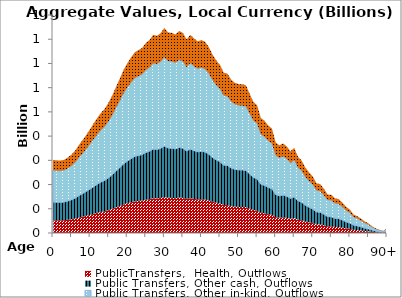
| Category | PublicTransfers,  Health, Outflows | Public Transfers, Other cash, Outflows | Public Transfers, Other in-kind, Outflows | Public Transfers, Education, Outflows |
|---|---|---|---|---|
| 0 | 52.944 | 74.813 | 130.972 | 43.032 |
|  | 52.658 | 74.41 | 130.266 | 42.8 |
| 2 | 52.478 | 74.155 | 129.82 | 42.654 |
| 3 | 52.986 | 74.873 | 131.077 | 43.067 |
| 4 | 54.716 | 77.317 | 135.356 | 44.472 |
| 5 | 56.821 | 80.292 | 140.565 | 46.184 |
| 6 | 59.765 | 84.452 | 147.847 | 48.577 |
| 7 | 63.808 | 90.165 | 157.848 | 51.862 |
| 8 | 67.337 | 95.151 | 166.577 | 54.731 |
| 9 | 71.223 | 100.643 | 176.191 | 57.889 |
| 10 | 75.268 | 106.359 | 186.198 | 61.177 |
| 11 | 79.528 | 112.378 | 196.736 | 64.639 |
| 12 | 83.635 | 118.181 | 206.895 | 67.978 |
| 13 | 87.247 | 123.286 | 215.831 | 70.914 |
| 14 | 90.189 | 127.442 | 223.108 | 73.305 |
| 15 | 94.612 | 133.694 | 234.052 | 76.9 |
| 16 | 99.806 | 141.033 | 246.9 | 81.122 |
| 17 | 105.879 | 149.614 | 261.924 | 86.058 |
| 18 | 111.86 | 158.065 | 276.719 | 90.919 |
| 19 | 118.037 | 166.794 | 292 | 95.94 |
| 20 | 122.884 | 173.643 | 303.991 | 99.879 |
| 21 | 127.024 | 179.494 | 314.232 | 103.244 |
| 22 | 130.789 | 184.813 | 323.545 | 106.304 |
| 23 | 132.475 | 187.195 | 327.715 | 107.674 |
| 24 | 133.966 | 189.303 | 331.405 | 108.886 |
| 25 | 137.616 | 194.461 | 340.435 | 111.853 |
| 26 | 139.808 | 197.558 | 345.858 | 113.635 |
| 27 | 143.558 | 202.857 | 355.133 | 116.683 |
| 28 | 142.825 | 201.82 | 353.319 | 116.087 |
| 29 | 144.731 | 204.514 | 358.035 | 117.636 |
| 30 | 148.519 | 209.868 | 367.407 | 120.715 |
| 31 | 145.311 | 205.334 | 359.47 | 118.107 |
| 32 | 144.977 | 204.863 | 358.645 | 117.836 |
| 33 | 143.765 | 203.15 | 355.646 | 116.851 |
| 34 | 146.423 | 206.905 | 362.22 | 119.011 |
| 35 | 144.92 | 204.782 | 358.504 | 117.79 |
| 36 | 140.269 | 198.21 | 346.998 | 114.01 |
| 37 | 143.542 | 202.834 | 355.094 | 116.67 |
| 38 | 140.916 | 199.124 | 348.599 | 114.536 |
| 39 | 138.811 | 196.149 | 343.39 | 112.824 |
| 40 | 139.782 | 197.521 | 345.792 | 113.613 |
| 41 | 138.462 | 195.656 | 342.527 | 112.541 |
| 42 | 134.617 | 190.223 | 333.016 | 109.416 |
| 43 | 129.213 | 182.586 | 319.646 | 105.023 |
| 44 | 124.97 | 176.59 | 309.15 | 101.574 |
| 45 | 121.811 | 172.126 | 301.335 | 99.007 |
| 46 | 116.131 | 164.101 | 287.286 | 94.391 |
| 47 | 115.427 | 163.106 | 285.544 | 93.818 |
| 48 | 111.137 | 157.044 | 274.931 | 90.331 |
| 49 | 108.776 | 153.708 | 269.09 | 88.412 |
| 50 | 107.853 | 152.404 | 266.807 | 87.662 |
| 51 | 107.695 | 152.181 | 266.417 | 87.534 |
| 52 | 106.995 | 151.192 | 264.685 | 86.965 |
| 53 | 100.765 | 142.387 | 249.271 | 81.901 |
| 54 | 94.987 | 134.223 | 234.98 | 77.205 |
| 55 | 92.538 | 130.763 | 228.921 | 75.214 |
| 56 | 83.344 | 117.771 | 206.177 | 67.742 |
| 57 | 81.295 | 114.875 | 201.107 | 66.076 |
| 58 | 77.876 | 110.044 | 192.65 | 63.297 |
| 59 | 75.682 | 106.944 | 187.222 | 61.514 |
| 60 | 65.627 | 92.735 | 162.347 | 53.341 |
| 61 | 63.471 | 89.688 | 157.013 | 51.588 |
| 62 | 64.889 | 91.692 | 160.522 | 52.741 |
| 63 | 62.706 | 88.608 | 155.122 | 50.967 |
| 64 | 59.161 | 83.599 | 146.353 | 48.086 |
| 65 | 61.688 | 87.168 | 152.602 | 50.139 |
| 66 | 55.28 | 78.115 | 136.753 | 44.931 |
| 67 | 52.497 | 74.181 | 129.867 | 42.669 |
| 68 | 47.356 | 66.917 | 117.15 | 38.491 |
| 69 | 43.939 | 62.089 | 108.696 | 35.713 |
| 70 | 40.946 | 57.859 | 101.292 | 33.28 |
| 71 | 36.003 | 50.875 | 89.064 | 29.263 |
| 72 | 35.416 | 50.044 | 87.611 | 28.785 |
| 73 | 32.003 | 45.223 | 79.17 | 26.012 |
| 74 | 27.875 | 39.389 | 68.957 | 22.657 |
| 75 | 27.644 | 39.063 | 68.385 | 22.469 |
| 76 | 25.096 | 35.462 | 62.083 | 20.398 |
| 77 | 24.541 | 34.679 | 60.71 | 19.947 |
| 78 | 21.978 | 31.056 | 54.368 | 17.863 |
| 79 | 18.977 | 26.815 | 46.945 | 15.424 |
| 80 | 16.948 | 23.948 | 41.926 | 13.775 |
| 81 | 13.38 | 18.907 | 33.1 | 10.875 |
| 82 | 12.132 | 17.143 | 30.011 | 9.861 |
| 83 | 10.456 | 14.775 | 25.865 | 8.498 |
| 84 | 8.393 | 11.86 | 20.762 | 6.822 |
| 85 | 6.976 | 9.857 | 17.257 | 5.67 |
| 86 | 4.877 | 6.892 | 12.065 | 3.964 |
| 87 | 3.228 | 4.562 | 7.986 | 2.624 |
| 88 | 2.254 | 3.185 | 5.576 | 1.832 |
| 89 | 1.404 | 1.984 | 3.474 | 1.141 |
| 90+ | 3.675 | 5.193 | 9.091 | 2.987 |